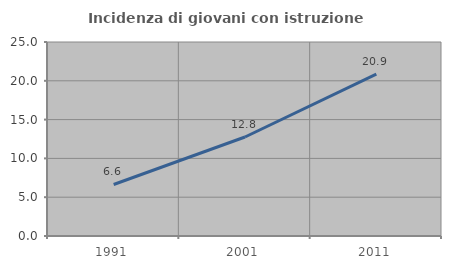
| Category | Incidenza di giovani con istruzione universitaria |
|---|---|
| 1991.0 | 6.637 |
| 2001.0 | 12.757 |
| 2011.0 | 20.853 |